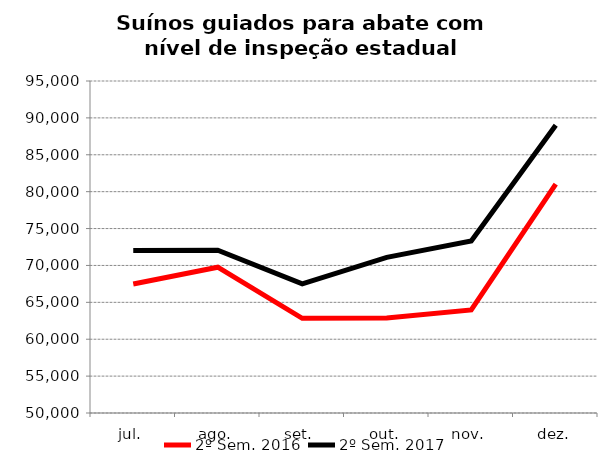
| Category | 2º Sem. 2016 | 2º Sem. 2017 |
|---|---|---|
| jul. | 67488 | 72029 |
| ago. | 69764 | 72069 |
| set. | 62839 | 67503 |
| out. | 62891 | 71094 |
| nov. | 63967 | 73328 |
| dez. | 81018 | 88990 |